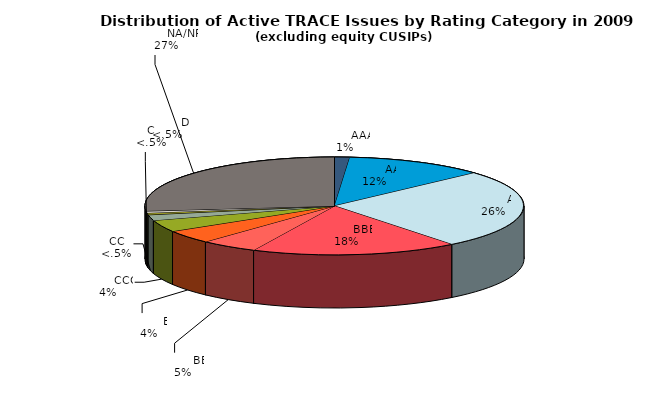
| Category | Series 0 |
|---|---|
|         AAA | 413 |
|         AA | 3811 |
|         A | 8365 |
|         BBB | 5635 |
|         BB | 1567 |
|         B | 1403 |
|         CCC | 1254 |
|         CC | 593 |
|         C | 205 |
|         D | 189 |
|         NA/NR | 8526 |